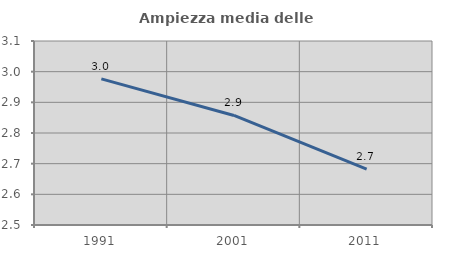
| Category | Ampiezza media delle famiglie |
|---|---|
| 1991.0 | 2.977 |
| 2001.0 | 2.857 |
| 2011.0 | 2.682 |